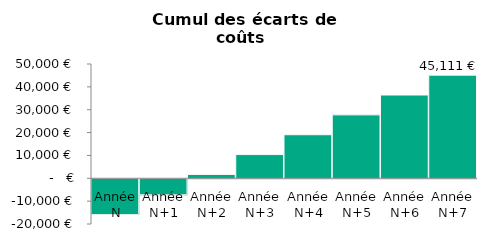
| Category | Différentiel Coût cumulé annuels Diesel / GNV |
|---|---|
| Année N | -15675.617 |
| Année N+1 | -6991.834 |
| Année N+2 | 1691.95 |
| Année N+3 | 10375.733 |
| Année N+4 | 19059.516 |
| Année N+5 | 27743.299 |
| Année N+6 | 36427.082 |
| Année N+7 | 45110.866 |